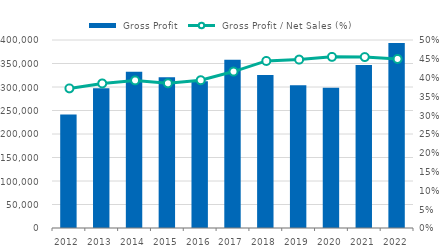
| Category |  Gross Profit |
|---|---|
| 2012.0 | 241507 |
| 2013.0 | 297208 |
| 2014.0 | 332607 |
| 2015.0 | 320812 |
| 2016.0 | 312161 |
| 2017.0 | 357812 |
| 2018.0 | 325484 |
| 2019.0 | 303702 |
| 2020.0 | 298351 |
| 2021.0 | 346827 |
| 2022.0 | 393883 |